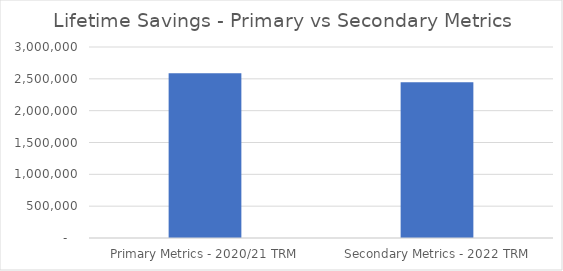
| Category | Series 0 |
|---|---|
|  Primary Metrics - 2020/21 TRM  | 2586436.951 |
|  Secondary Metrics - 2022 TRM  | 2446887.769 |